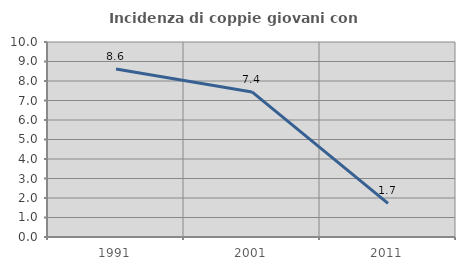
| Category | Incidenza di coppie giovani con figli |
|---|---|
| 1991.0 | 8.621 |
| 2001.0 | 7.438 |
| 2011.0 | 1.724 |